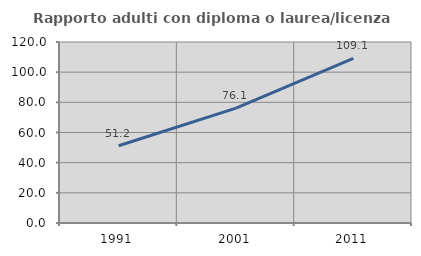
| Category | Rapporto adulti con diploma o laurea/licenza media  |
|---|---|
| 1991.0 | 51.188 |
| 2001.0 | 76.114 |
| 2011.0 | 109.143 |